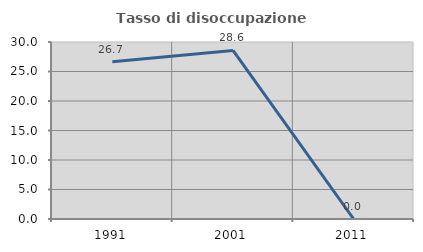
| Category | Tasso di disoccupazione giovanile  |
|---|---|
| 1991.0 | 26.667 |
| 2001.0 | 28.571 |
| 2011.0 | 0 |